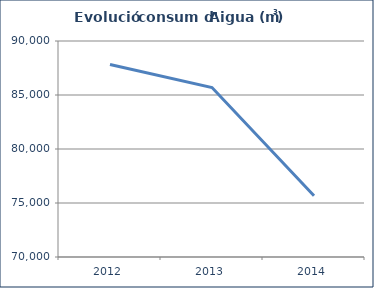
| Category | Aigua (m3) |
|---|---|
| 2012.0 | 87831 |
| 2013.0 | 85688 |
| 2014.0 | 75679 |